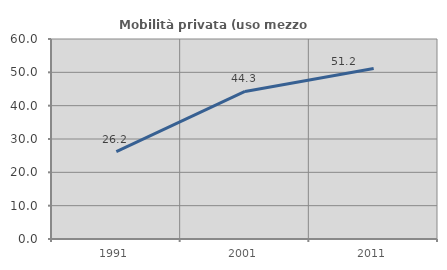
| Category | Mobilità privata (uso mezzo privato) |
|---|---|
| 1991.0 | 26.214 |
| 2001.0 | 44.267 |
| 2011.0 | 51.166 |